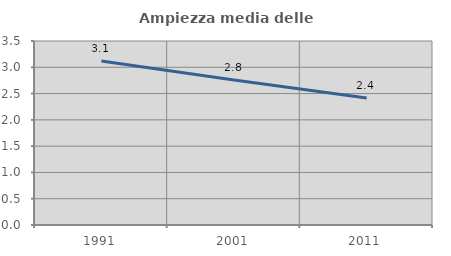
| Category | Ampiezza media delle famiglie |
|---|---|
| 1991.0 | 3.121 |
| 2001.0 | 2.756 |
| 2011.0 | 2.415 |